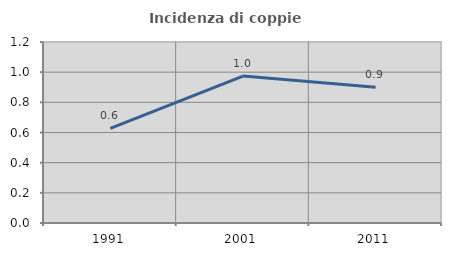
| Category | Incidenza di coppie miste |
|---|---|
| 1991.0 | 0.627 |
| 2001.0 | 0.974 |
| 2011.0 | 0.899 |